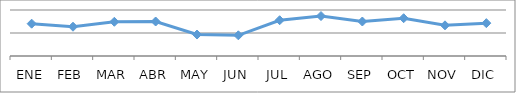
| Category | Porcentaje de recién nacidos con 2 controles CRED | Series 1 |
|---|---|---|
| ENE | 70.27 |  |
| FEB | 63.636 |  |
| MAR | 74.359 |  |
| ABR | 75 |  |
| MAY | 46.667 |  |
| JUN | 45 |  |
| JUL | 77.778 |  |
| AGO | 86.842 |  |
| SEP | 75 |  |
| OCT | 82.143 |  |
| NOV | 66.667 |  |
| DIC | 71.429 |  |